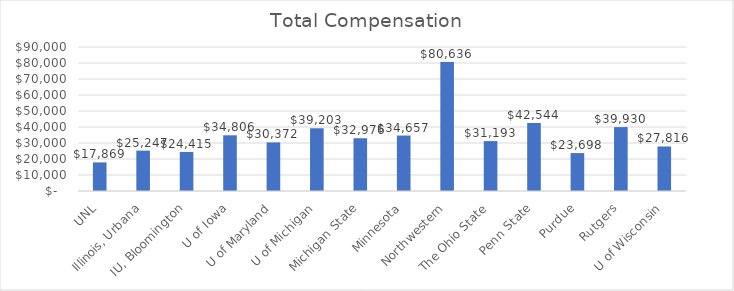
| Category | Series 0 |
|---|---|
| UNL | 17869.183 |
| Illinois, Urbana | 25246.84 |
| IU, Bloomington | 24414.84 |
| U of Iowa | 34806.2 |
| U of Maryland | 30372.2 |
| U of Michigan | 39202.81 |
| Michigan State | 32976 |
| Minnesota | 34657.182 |
| Northwestern | 80636 |
| The Ohio State | 31192.8 |
| Penn State | 42544 |
| Purdue | 23697.8 |
| Rutgers | 39930 |
| U of Wisconsin | 27816.48 |